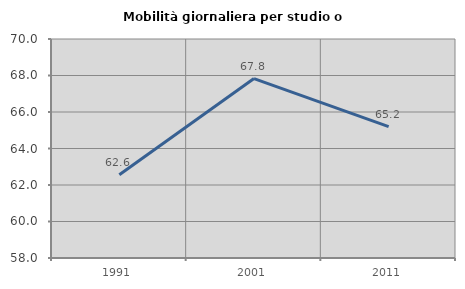
| Category | Mobilità giornaliera per studio o lavoro |
|---|---|
| 1991.0 | 62.56 |
| 2001.0 | 67.834 |
| 2011.0 | 65.197 |